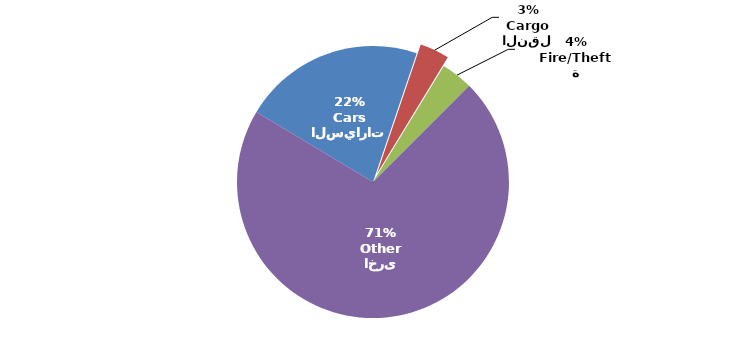
| Category | Series 0 |
|---|---|
| السيارات
Cars | 621181 |
| النقل
Cargo | 100777 |
| الحريق/السرقة
Fire/Theft | 108972 |
| اخرى
Other | 2045146 |